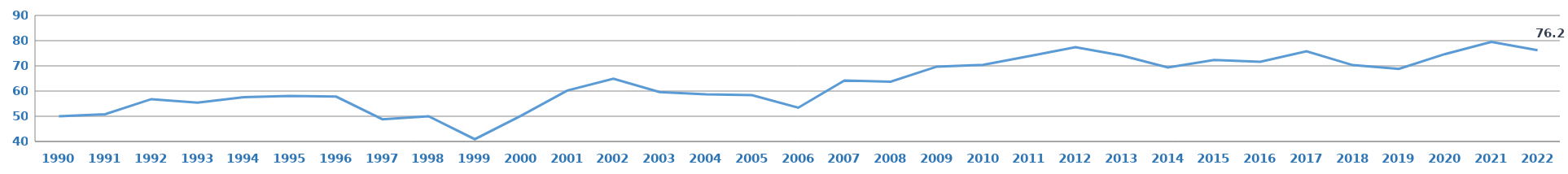
| Category | BTS |
|---|---|
| 1990.0 | 50 |
| 1991.0 | 50.8 |
| 1992.0 | 56.8 |
| 1993.0 | 55.4 |
| 1994.0 | 57.6 |
| 1995.0 | 58.1 |
| 1996.0 | 57.8 |
| 1997.0 | 48.8 |
| 1998.0 | 50 |
| 1999.0 | 40.9 |
| 2000.0 | 50.2 |
| 2001.0 | 60.2 |
| 2002.0 | 64.9 |
| 2003.0 | 59.6 |
| 2004.0 | 58.7 |
| 2005.0 | 58.4 |
| 2006.0 | 53.4 |
| 2007.0 | 64.2 |
| 2008.0 | 63.7 |
| 2009.0 | 69.7 |
| 2010.0 | 70.4 |
| 2011.0 | 73.9 |
| 2012.0 | 77.4 |
| 2013.0 | 74.1 |
| 2014.0 | 69.4 |
| 2015.0 | 72.3 |
| 2016.0 | 71.6 |
| 2017.0 | 75.8 |
| 2018.0 | 70.3 |
| 2019.0 | 68.801 |
| 2020.0 | 74.7 |
| 2021.0 | 79.526 |
| 2022.0 | 76.2 |